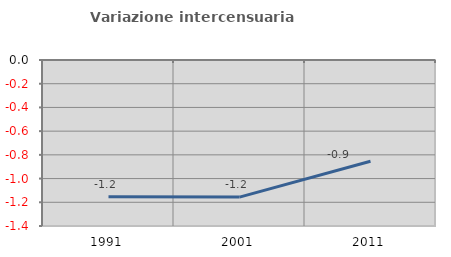
| Category | Variazione intercensuaria annua |
|---|---|
| 1991.0 | -1.153 |
| 2001.0 | -1.156 |
| 2011.0 | -0.854 |